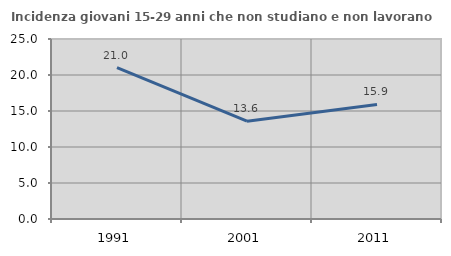
| Category | Incidenza giovani 15-29 anni che non studiano e non lavorano  |
|---|---|
| 1991.0 | 21.019 |
| 2001.0 | 13.588 |
| 2011.0 | 15.909 |